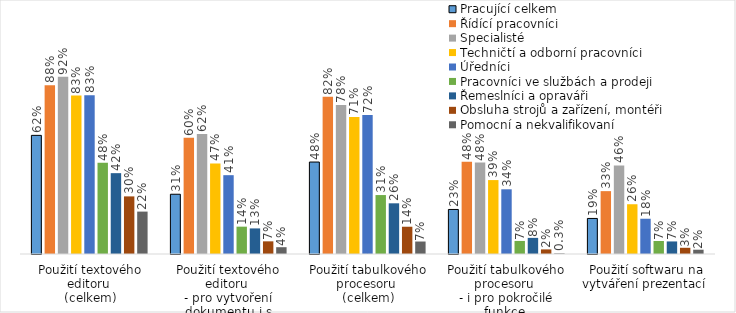
| Category | Pracující celkem | Řídící pracovníci | Specialisté | Techničtí a odborní pracovníci | Úředníci | Pracovníci ve službách a prodeji | Řemeslníci a opraváři | Obsluha strojů a zařízení, montéři | Pomocní a nekvalifikovaní |
|---|---|---|---|---|---|---|---|---|---|
| Použití textového editoru 
(celkem) | 0.618 | 0.878 | 0.923 | 0.825 | 0.826 | 0.475 | 0.421 | 0.3 | 0.221 |
| Použití textového editoru 
- pro vytvoření dokumentu i s obrázky nebo grafy | 0.311 | 0.605 | 0.624 | 0.472 | 0.411 | 0.142 | 0.133 | 0.066 | 0.035 |
| Použití tabulkového procesoru 
(celkem) | 0.479 | 0.819 | 0.776 | 0.713 | 0.724 | 0.307 | 0.264 | 0.142 | 0.065 |
| Použití tabulkového procesoru 
- i pro pokročilé funkce  | 0.232 | 0.481 | 0.476 | 0.385 | 0.337 | 0.068 | 0.084 | 0.024 | 0.003 |
| Použití softwaru na vytváření prezentací  | 0.185 | 0.327 | 0.461 | 0.259 | 0.184 | 0.068 | 0.065 | 0.032 | 0.022 |